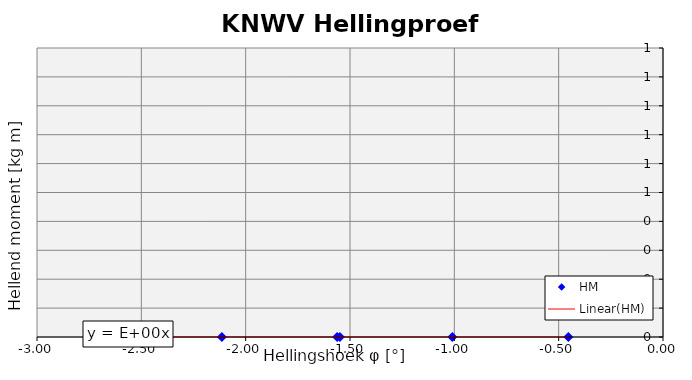
| Category | HM |
|---|---|
| -1.549 | 0 |
| -1.009 | 0 |
| -0.453 | 0 |
| -1.562 | 0 |
| -2.114 | 0 |
| -2.702 | 0 |